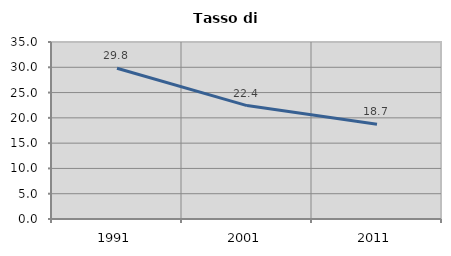
| Category | Tasso di disoccupazione   |
|---|---|
| 1991.0 | 29.821 |
| 2001.0 | 22.428 |
| 2011.0 | 18.749 |